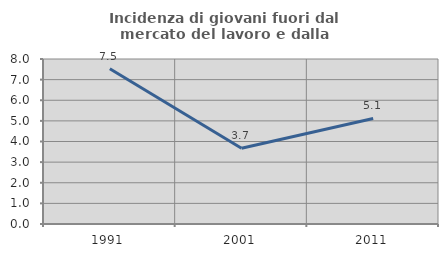
| Category | Incidenza di giovani fuori dal mercato del lavoro e dalla formazione  |
|---|---|
| 1991.0 | 7.53 |
| 2001.0 | 3.676 |
| 2011.0 | 5.118 |